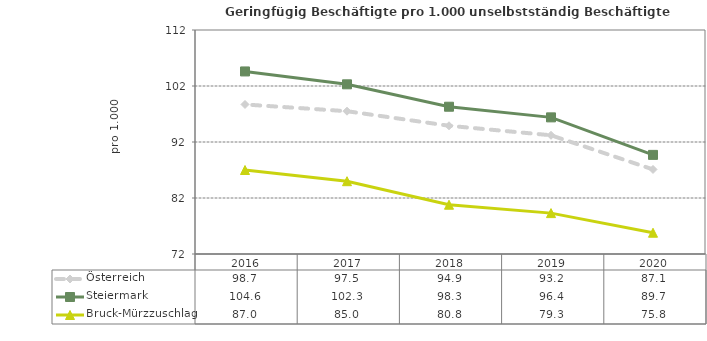
| Category | Österreich | Steiermark | Bruck-Mürzzuschlag |
|---|---|---|---|
| 2020.0 | 87.1 | 89.7 | 75.8 |
| 2019.0 | 93.2 | 96.4 | 79.3 |
| 2018.0 | 94.9 | 98.3 | 80.8 |
| 2017.0 | 97.5 | 102.3 | 85 |
| 2016.0 | 98.7 | 104.6 | 87 |